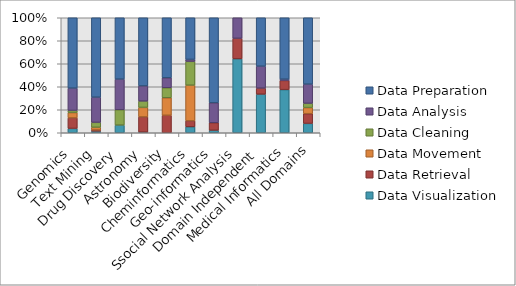
| Category | Data Visualization | Data Retrieval | Data Movement | Data Cleaning | Data Analysis | Data Preparation |
|---|---|---|---|---|---|---|
| Genomics | 26 | 63 | 32 | 13 | 134 | 422 |
| Text Mining | 3 | 2 | 5 | 9 | 46 | 145 |
| Drug Discovery | 3 | 0 | 0 | 6 | 12 | 24 |
| Astronomy | 2 | 48 | 30 | 20 | 48 | 215 |
| Biodiversity | 0 | 7 | 7 | 4 | 4 | 24 |
| Cheminformatics | 3 | 3 | 18 | 12 | 1 | 21 |
| Geo-informatics | 1 | 3 | 0 | 0 | 8 | 34 |
| Ssocial Network Analysis | 18 | 5 | 0 | 0 | 5 | 0 |
| Domain Independent | 51 | 8 | 0 | 0 | 29 | 64 |
| Medical Informatics | 33 | 7 | 0 | 0 | 1 | 47 |
| All Domains | 140 | 146 | 92 | 64 | 288 | 996 |